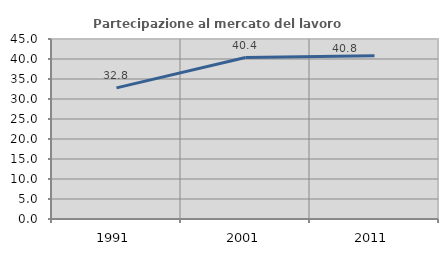
| Category | Partecipazione al mercato del lavoro  femminile |
|---|---|
| 1991.0 | 32.784 |
| 2001.0 | 40.354 |
| 2011.0 | 40.785 |